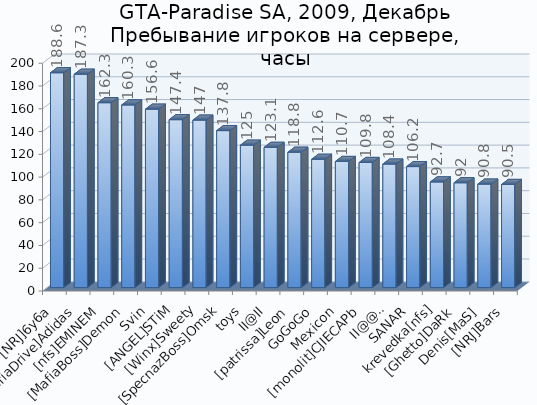
| Category | Series 0 |
|---|---|
| [NRJ]6y6a | 188.6 |
| [MafiaDrive]Adidas | 187.3 |
| [nfs]EMINEM | 162.3 |
| [MafiaBoss]Demon | 160.3 |
| Svin | 156.6 |
| [ANGEL]STiM | 147.4 |
| [Winx]Sweety | 147 |
| [SpecnazBoss]Omsk | 137.8 |
| toys | 125 |
| II@II | 123.1 |
| [patrissa]Leon | 118.8 |
| GoGoGo | 112.6 |
| Mexicon | 110.7 |
| [monolit]CJIECAPb | 109.8 |
| II@@II | 108.4 |
| SANAR | 106.2 |
| krevedka[nfs] | 92.7 |
| [Ghetto]DaRk | 92 |
| Denis[MaS] | 90.8 |
| [NRJ]Bars | 90.5 |